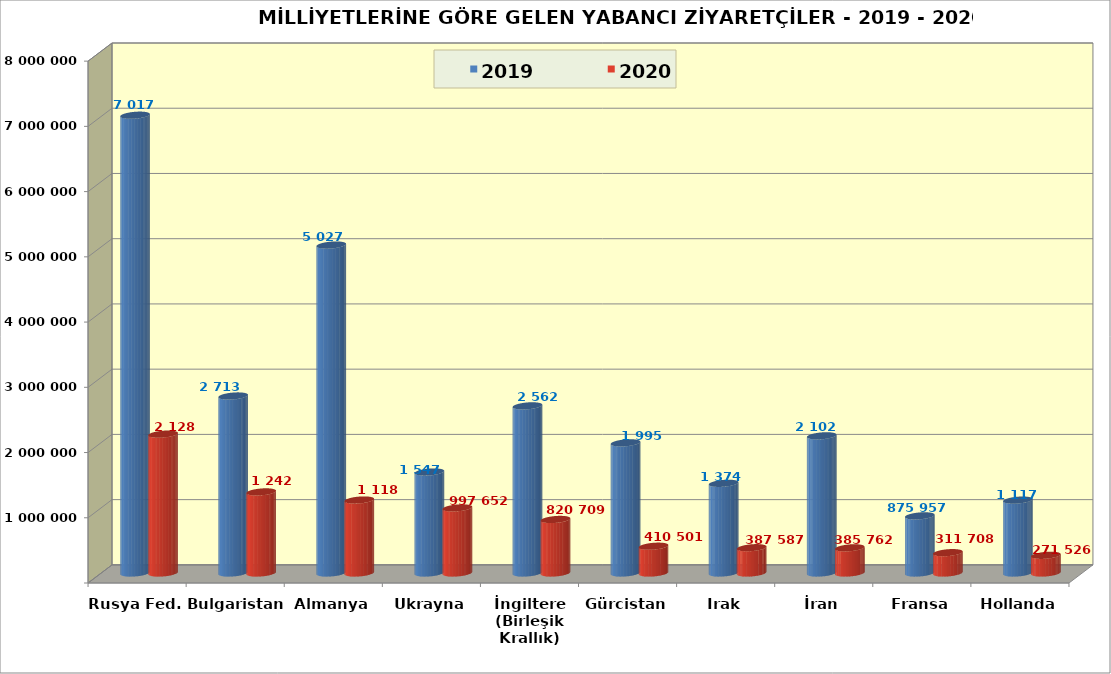
| Category | 2019 | 2020 |
|---|---|---|
| Rusya Fed. | 7017657 | 2128758 |
| Bulgaristan | 2713464 | 1242961 |
| Almanya | 5027472 | 1118932 |
| Ukrayna | 1547996 | 997652 |
| İngiltere (Birleşik Krallık) | 2562064 | 820709 |
| Gürcistan | 1995254 | 410501 |
| Irak | 1374896 | 387587 |
| İran | 2102890 | 385762 |
| Fransa | 875957 | 311708 |
| Hollanda | 1117290 | 271526 |